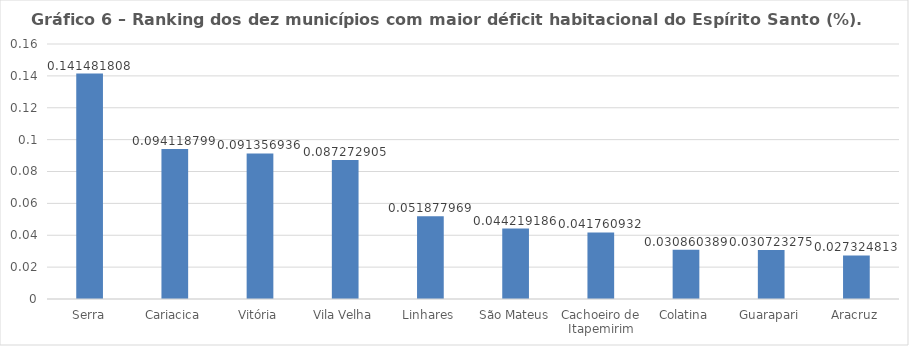
| Category | Series 0 |
|---|---|
| Serra | 0.141 |
| Cariacica | 0.094 |
| Vitória | 0.091 |
| Vila Velha | 0.087 |
| Linhares | 0.052 |
| São Mateus | 0.044 |
| Cachoeiro de Itapemirim | 0.042 |
| Colatina | 0.031 |
| Guarapari | 0.031 |
| Aracruz | 0.027 |